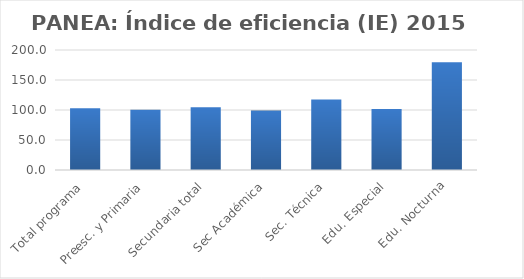
| Category | Índice de eficiencia (IE)  |
|---|---|
| Total programa | 103.016 |
| Preesc. y Primaria | 100.303 |
| Secundaria total | 104.502 |
| Sec Académica | 99.121 |
| Sec. Técnica | 117.497 |
| Edu. Especial | 101.508 |
| Edu. Nocturna | 179.663 |